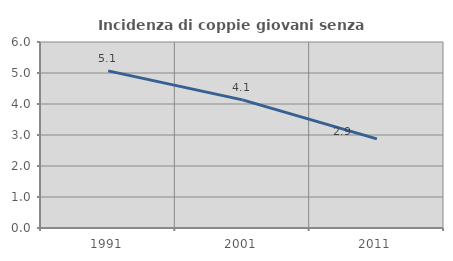
| Category | Incidenza di coppie giovani senza figli |
|---|---|
| 1991.0 | 5.068 |
| 2001.0 | 4.134 |
| 2011.0 | 2.875 |